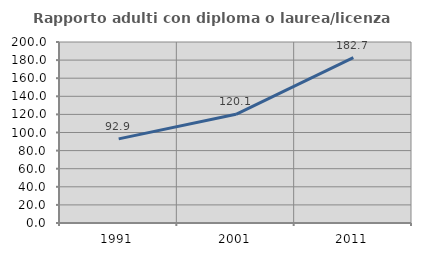
| Category | Rapporto adulti con diploma o laurea/licenza media  |
|---|---|
| 1991.0 | 92.946 |
| 2001.0 | 120.066 |
| 2011.0 | 182.72 |